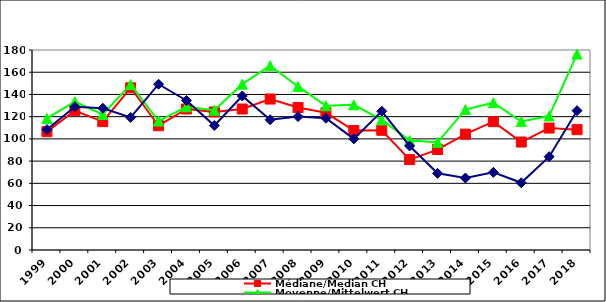
| Category | Médiane/Median CH | Moyenne/Mittelwert CH | Aargau |
|---|---|---|---|
| 1999.0 | 106.5 | 118.448 | 108.4 |
| 2000.0 | 125.4 | 133.52 | 128.9 |
| 2001.0 | 115.55 | 121.946 | 127.6 |
| 2002.0 | 146 | 148.915 | 119.3 |
| 2003.0 | 111.85 | 116.062 | 149.2 |
| 2004.0 | 126.9 | 128.865 | 134.6 |
| 2005.0 | 124.25 | 125.821 | 112 |
| 2006.0 | 126.9 | 149.264 | 138.6 |
| 2007.0 | 135.85 | 165.89 | 117.2 |
| 2008.0 | 128.185 | 147.205 | 120.1 |
| 2009.0 | 123.49 | 129.818 | 118.6 |
| 2010.0 | 107.55 | 130.614 | 100 |
| 2011.0 | 107.75 | 117.142 | 124.9 |
| 2012.0 | 81.375 | 98.616 | 93.6 |
| 2013.0 | 90.385 | 96.916 | 69 |
| 2014.0 | 104.25 | 126.395 | 64.8 |
| 2015.0 | 115.5 | 132.601 | 69.9 |
| 2016.0 | 97.18 | 115.652 | 60.5 |
| 2017.0 | 109.75 | 120.565 | 84 |
| 2018.0 | 108.3 | 176.291 | 125.4 |